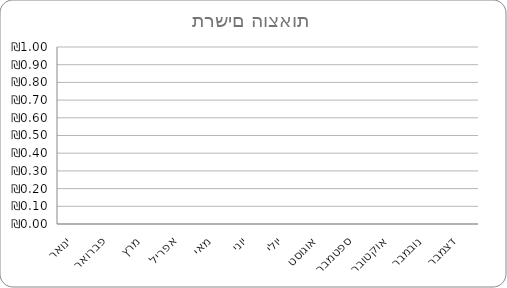
| Category | הוצאות |
|---|---|
| ינואר | 0 |
| פברואר | 0 |
| מרץ | 0 |
| אפריל | 0 |
| מאי | 0 |
| יוני | 0 |
| יולי | 0 |
| אוגוסט | 0 |
| ספטמבר | 0 |
| אוקטובר | 0 |
| נובמבר | 0 |
| דצמבר | 0 |